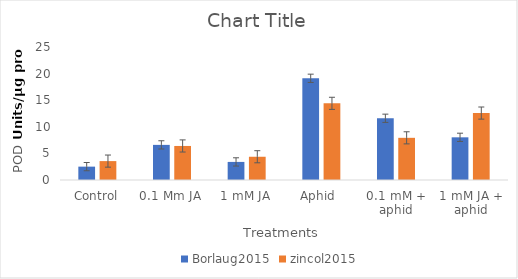
| Category | Borlaug2015 | zincol2015 |
|---|---|---|
| Control | 2.513 | 3.553 |
| 0.1 Mm JA | 6.602 | 6.398 |
| 1 mM JA | 3.398 | 4.37 |
| Aphid  | 19.117 | 14.412 |
| 0.1 mM + aphid | 11.604 | 7.928 |
| 1 mM JA + aphid | 8.023 | 12.581 |